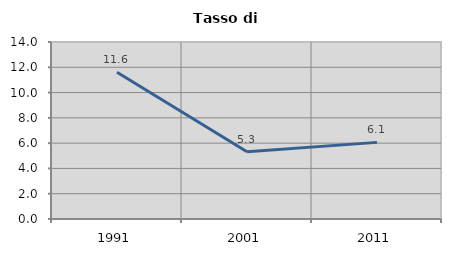
| Category | Tasso di disoccupazione   |
|---|---|
| 1991.0 | 11.6 |
| 2001.0 | 5.314 |
| 2011.0 | 6.061 |